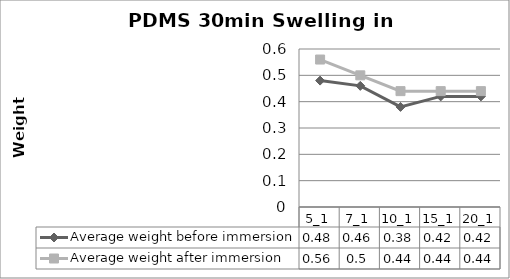
| Category | Average weight before immersion | Average weight after immersion |
|---|---|---|
| 5_1 | 0.48 | 0.56 |
| 7_1 | 0.46 | 0.5 |
| 10_1 | 0.38 | 0.44 |
| 15_1 | 0.42 | 0.44 |
| 20_1 | 0.42 | 0.44 |